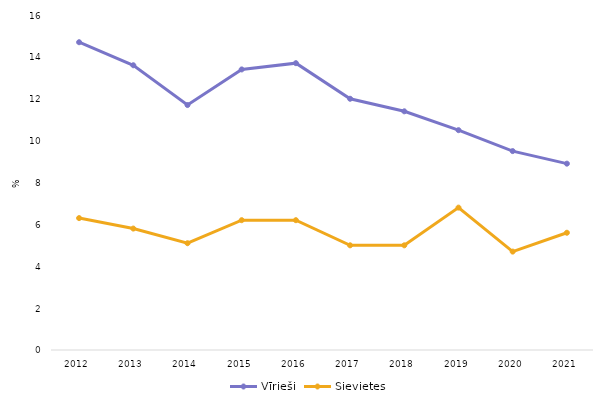
| Category | Vīrieši | Sievietes  |
|---|---|---|
| 2012 | 14.7 | 6.3 |
| 2013 | 13.6 | 5.8 |
| 2014 | 11.7 | 5.1 |
| 2015 | 13.4 | 6.2 |
| 2016 | 13.7 | 6.2 |
| 2017 | 12 | 5 |
| 2018 | 11.4 | 5 |
| 2019 | 10.5 | 6.8 |
| 2020 | 9.5 | 4.7 |
| 2021 | 8.9 | 5.6 |